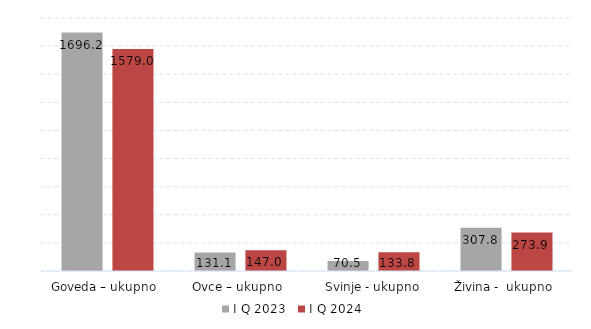
| Category | I Q 2023 | I Q 2024 |
|---|---|---|
| Goveda – ukupno  | 1696.203 | 1578.952 |
| Ovce – ukupno  | 131.1 | 147 |
| Svinje - ukupno | 70.51 | 133.8 |
| Živina -  ukupno  | 307.8 | 273.9 |